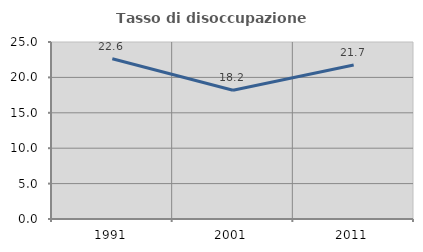
| Category | Tasso di disoccupazione giovanile  |
|---|---|
| 1991.0 | 22.642 |
| 2001.0 | 18.182 |
| 2011.0 | 21.739 |